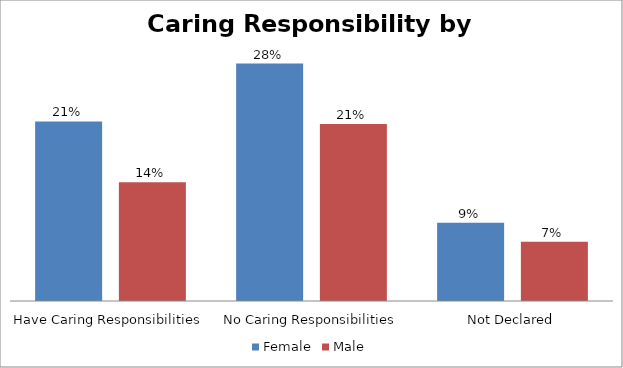
| Category | Female | Male |
|---|---|---|
| Have Caring Responsibilities | 0.211 | 0.14 |
| No Caring Responsibilities | 0.279 | 0.208 |
| Not Declared | 0.092 | 0.07 |